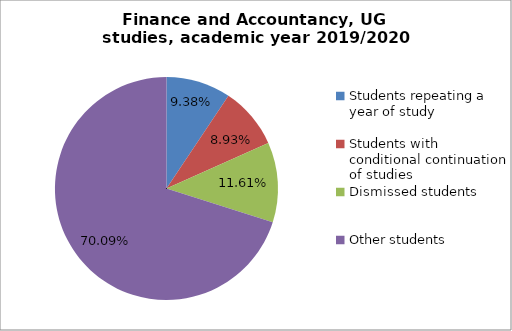
| Category | Series 0 |
|---|---|
| Students repeating a year of study | 42 |
| Students with conditional continuation of studies | 40 |
| Dismissed students | 52 |
| Other students | 314 |